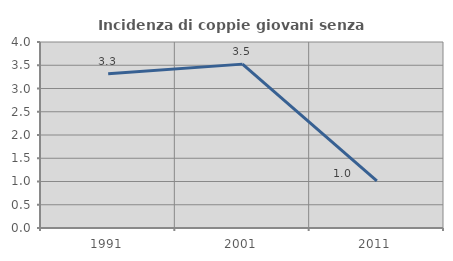
| Category | Incidenza di coppie giovani senza figli |
|---|---|
| 1991.0 | 3.32 |
| 2001.0 | 3.524 |
| 2011.0 | 1.015 |